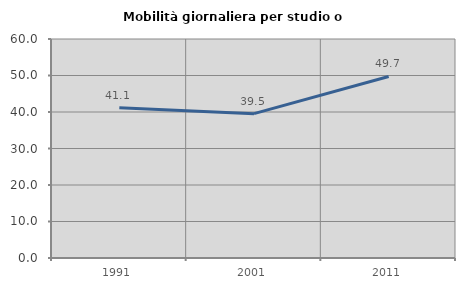
| Category | Mobilità giornaliera per studio o lavoro |
|---|---|
| 1991.0 | 41.141 |
| 2001.0 | 39.543 |
| 2011.0 | 49.742 |